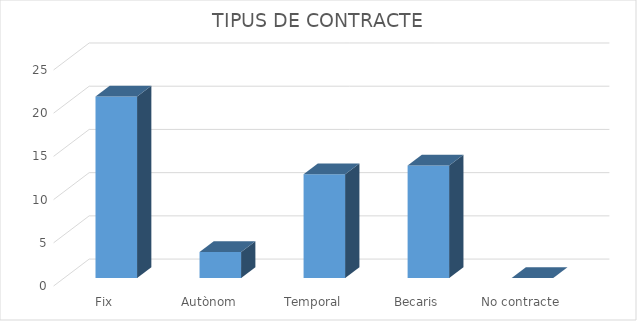
| Category | Series 0 |
|---|---|
| Fix | 21 |
| Autònom | 3 |
| Temporal | 12 |
| Becaris | 13 |
| No contracte | 0 |